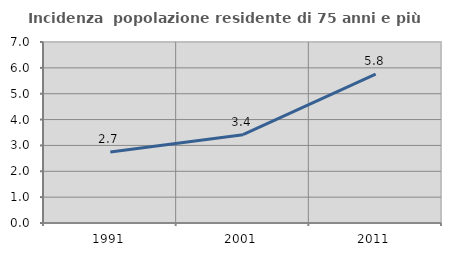
| Category | Incidenza  popolazione residente di 75 anni e più |
|---|---|
| 1991.0 | 2.745 |
| 2001.0 | 3.416 |
| 2011.0 | 5.758 |